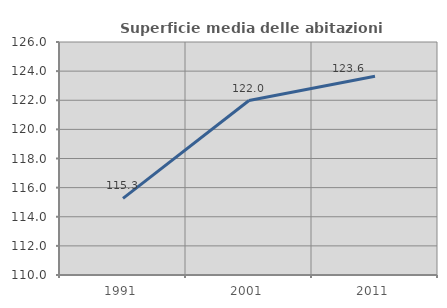
| Category | Superficie media delle abitazioni occupate |
|---|---|
| 1991.0 | 115.265 |
| 2001.0 | 121.982 |
| 2011.0 | 123.644 |